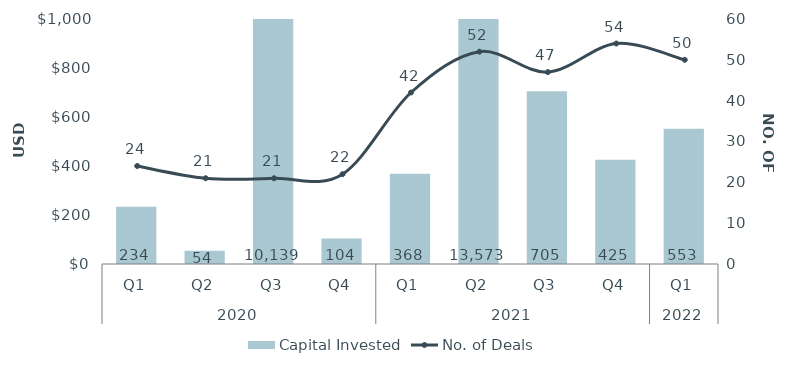
| Category | Capital Invested |
|---|---|
| 0 | 233.725 |
| 1 | 54.336 |
| 2 | 10138.85 |
| 3 | 103.983 |
| 4 | 368.119 |
| 5 | 13572.596 |
| 6 | 705.441 |
| 7 | 425.119 |
| 8 | 552.537 |